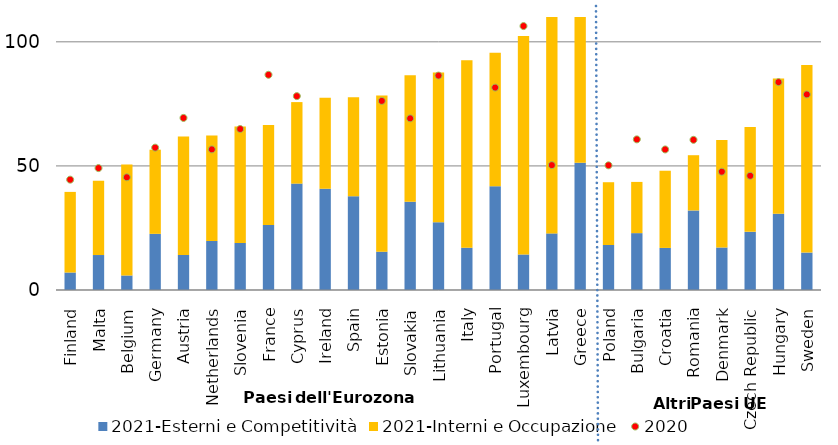
| Category | 2021-Esterni e Competitività | 2021-Interni e Occupazione |
|---|---|---|
| Finland | 7.048 | 32.481 |
| Malta | 14.087 | 29.978 |
| Belgium | 5.857 | 44.69 |
| Germany | 22.623 | 33.92 |
| Austria | 14.095 | 47.716 |
| Netherlands | 19.746 | 42.498 |
| Slovenia | 18.975 | 46.896 |
| France | 26.202 | 40.298 |
| Cyprus | 42.866 | 32.844 |
| Ireland | 40.837 | 36.66 |
| Spain | 37.794 | 39.829 |
| Estonia | 15.431 | 62.915 |
| Slovakia | 35.544 | 50.988 |
| Lithuania | 27.32 | 60.326 |
| Italy | 17.032 | 75.57 |
| Portugal | 41.819 | 53.815 |
| Luxembourg | 14.317 | 87.977 |
| Latvia | 22.814 | 101.955 |
| Greece | 51.256 | 83.947 |
| Poland | 18.125 | 25.297 |
| Bulgaria | 22.914 | 20.64 |
| Croatia | 16.957 | 31.096 |
| Romania | 32.061 | 22.248 |
| Denmark | 17.127 | 43.323 |
| Czech Republic | 23.43 | 42.227 |
| Hungary | 30.678 | 54.522 |
| Sweden | 15.083 | 75.572 |